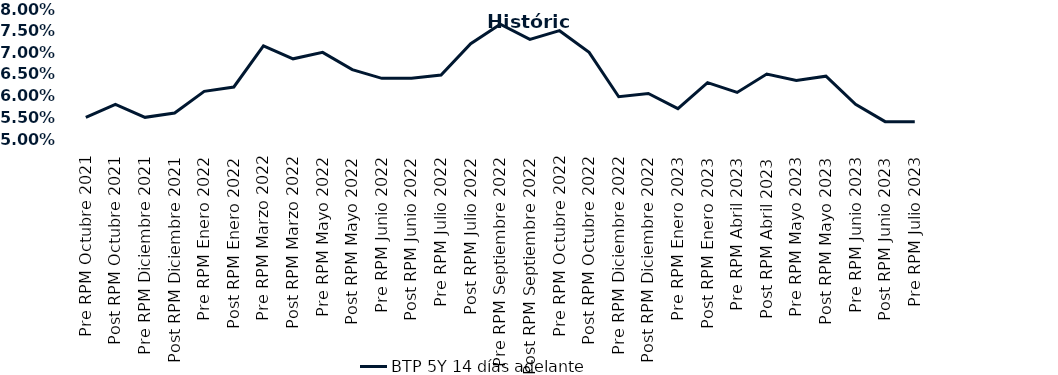
| Category | BTP 5Y 14 días adelante |
|---|---|
| Pre RPM Octubre 2021 | 0.055 |
| Post RPM Octubre 2021 | 0.058 |
| Pre RPM Diciembre 2021 | 0.055 |
| Post RPM Diciembre 2021 | 0.056 |
| Pre RPM Enero 2022 | 0.061 |
| Post RPM Enero 2022 | 0.062 |
| Pre RPM Marzo 2022 | 0.072 |
| Post RPM Marzo 2022 | 0.068 |
| Pre RPM Mayo 2022 | 0.07 |
| Post RPM Mayo 2022 | 0.066 |
| Pre RPM Junio 2022 | 0.064 |
| Post RPM Junio 2022 | 0.064 |
| Pre RPM Julio 2022 | 0.065 |
| Post RPM Julio 2022 | 0.072 |
| Pre RPM Septiembre 2022 | 0.076 |
| Post RPM Septiembre 2022 | 0.073 |
| Pre RPM Octubre 2022 | 0.075 |
| Post RPM Octubre 2022 | 0.07 |
| Pre RPM Diciembre 2022 | 0.06 |
| Post RPM Diciembre 2022 | 0.06 |
| Pre RPM Enero 2023 | 0.057 |
| Post RPM Enero 2023 | 0.063 |
| Pre RPM Abril 2023 | 0.061 |
| Post RPM Abril 2023 | 0.065 |
| Pre RPM Mayo 2023 | 0.064 |
| Post RPM Mayo 2023 | 0.064 |
| Pre RPM Junio 2023 | 0.058 |
| Post RPM Junio 2023 | 0.054 |
| Pre RPM Julio 2023 | 0.054 |